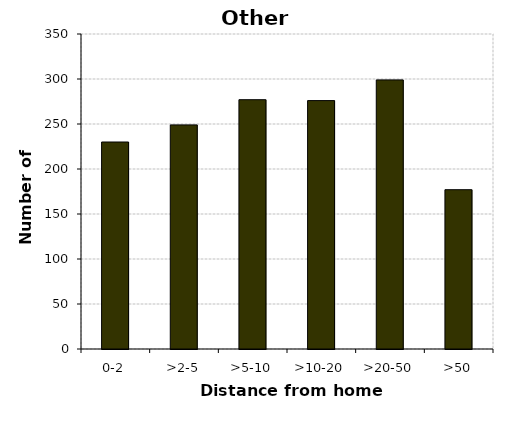
| Category | Other vehicles |
|---|---|
| 0-2 | 230 |
| >2-5 | 249 |
| >5-10 | 277 |
| >10-20 | 276 |
| >20-50 | 299 |
| >50 | 177 |